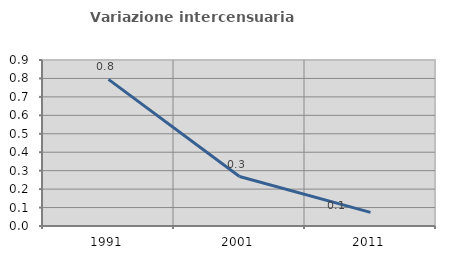
| Category | Variazione intercensuaria annua |
|---|---|
| 1991.0 | 0.795 |
| 2001.0 | 0.268 |
| 2011.0 | 0.074 |